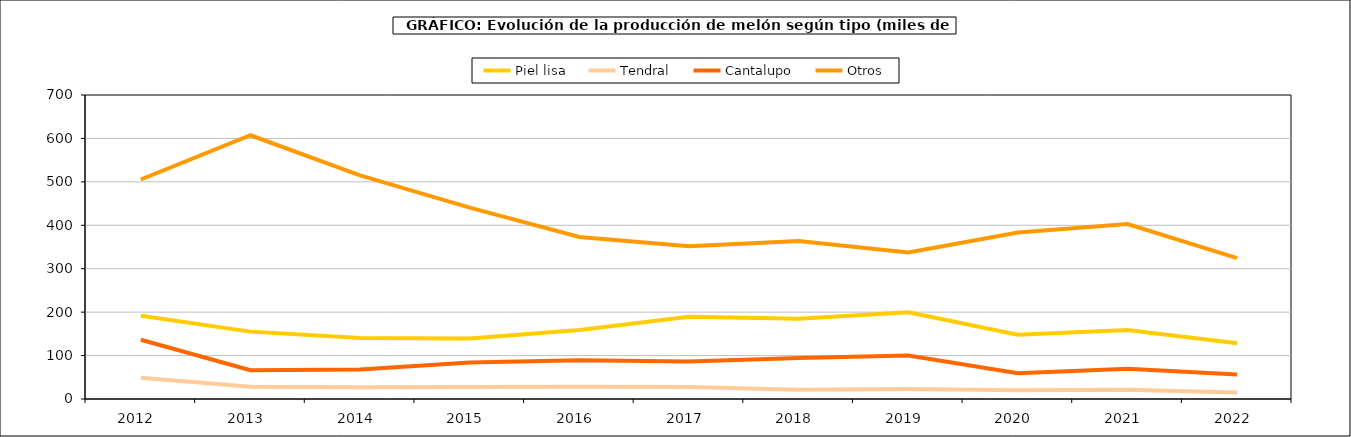
| Category | Piel lisa | Tendral | Cantalupo | Otros |
|---|---|---|---|---|
| 2012.0 | 191.896 | 49.169 | 136.333 | 505.471 |
| 2013.0 | 155.121 | 28.073 | 66.453 | 607.304 |
| 2014.0 | 140.682 | 27.23 | 67.816 | 514.864 |
| 2015.0 | 139.486 | 27.748 | 84.305 | 440.517 |
| 2016.0 | 158.886 | 28.45 | 89.425 | 373.006 |
| 2017.0 | 189.59 | 27.88 | 86.499 | 351.708 |
| 2018.0 | 184.675 | 21.163 | 94.594 | 363.921 |
| 2019.0 | 199.826 | 22.833 | 100.181 | 337.351 |
| 2020.0 | 147.925 | 20.256 | 59.257 | 383.54 |
| 2021.0 | 158.644 | 21.431 | 69.797 | 402.731 |
| 2022.0 | 128.389 | 15.023 | 56.311 | 324.312 |